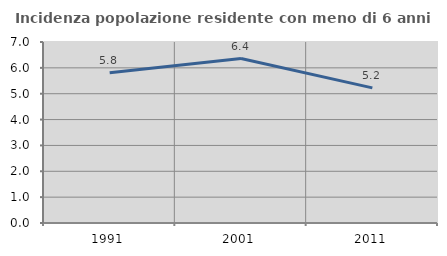
| Category | Incidenza popolazione residente con meno di 6 anni |
|---|---|
| 1991.0 | 5.811 |
| 2001.0 | 6.36 |
| 2011.0 | 5.225 |